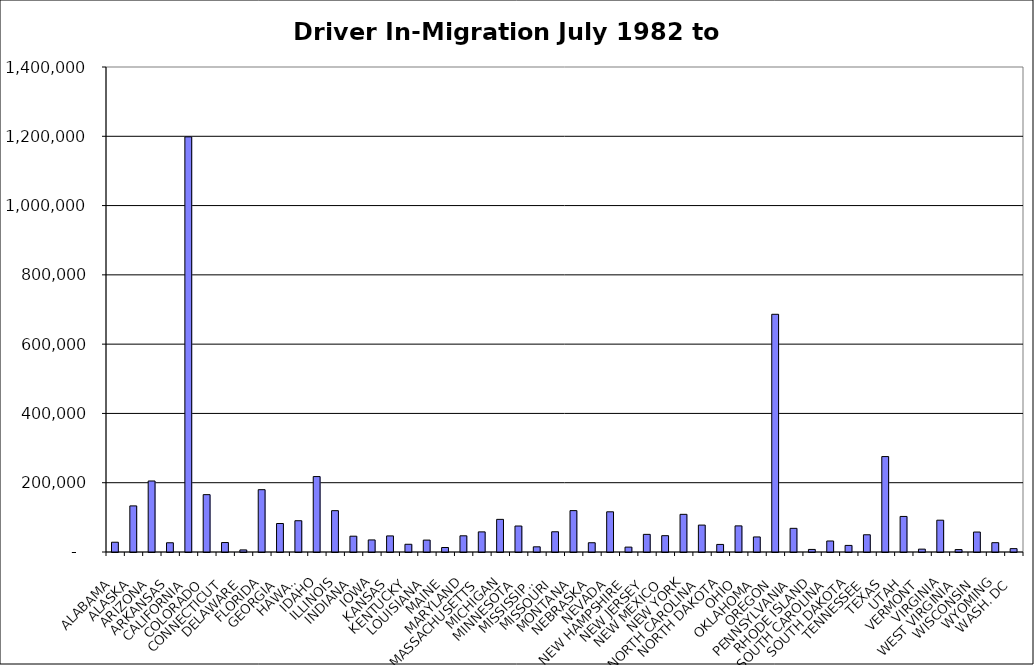
| Category | Series 0 |
|---|---|
| ALABAMA | 28221.5 |
| ALASKA | 133097.5 |
| ARIZONA | 204954 |
| ARKANSAS | 26692.5 |
| CALIFORNIA | 1198373.5 |
| COLORADO | 165555 |
| CONNECTICUT | 27325 |
| DELAWARE | 6035.5 |
| FLORIDA | 179903 |
| GEORGIA | 82244 |
| HAWAII | 90294.5 |
| IDAHO | 217732.5 |
| ILLINOIS | 119336.5 |
| INDIANA | 45633 |
| IOWA | 34862.5 |
| KANSAS | 46446.5 |
| KENTUCKY | 22323 |
| LOUISIANA | 34334.5 |
| MAINE | 12961.5 |
| MARYLAND | 46731 |
| MASSACHUSETTS | 58059 |
| MICHIGAN | 94210 |
| MINNESOTA | 75004.5 |
| MISSISSIPPI | 14945 |
| MISSOURI | 58408 |
| MONTANA | 119471 |
| NEBRASKA | 26718.5 |
| NEVADA | 116032 |
| NEW HAMPSHIRE | 14089.5 |
| NEW JERSEY | 50884 |
| NEW MEXICO | 47091 |
| NEW YORK | 108719 |
| NORTH CAROLINA | 77700.5 |
| NORTH DAKOTA | 21853.5 |
| OHIO | 75400.5 |
| OKLAHOMA | 43436 |
| OREGON | 686166 |
| PENNSYLVANIA | 68297.5 |
| RHODE ISLAND | 7417 |
| SOUTH CAROLINA | 31768.5 |
| SOUTH DAKOTA | 18988.5 |
| TENNESSEE | 49741.5 |
| TEXAS | 275488 |
| UTAH | 102617.5 |
| VERMONT | 8275 |
| VIRGINIA | 91792 |
| WEST VIRGINIA | 6989.5 |
| WISCONSIN | 57621.5 |
| WYOMING | 26887 |
| WASH. DC | 9731 |